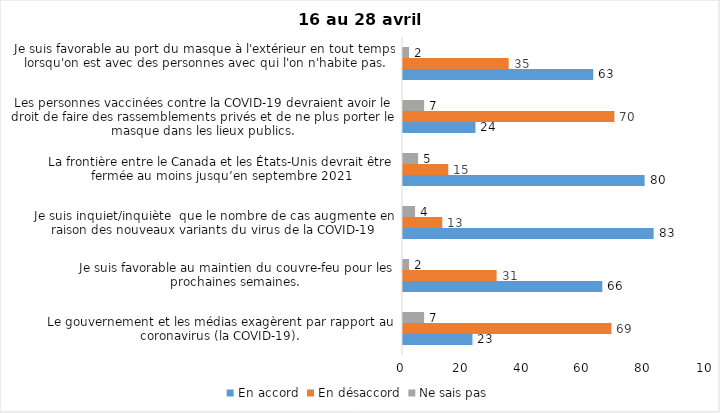
| Category | En accord | En désaccord | Ne sais pas |
|---|---|---|---|
| Le gouvernement et les médias exagèrent par rapport au coronavirus (la COVID-19). | 23 | 69 | 7 |
| Je suis favorable au maintien du couvre-feu pour les prochaines semaines. | 66 | 31 | 2 |
| Je suis inquiet/inquiète  que le nombre de cas augmente en raison des nouveaux variants du virus de la COVID-19 | 83 | 13 | 4 |
| La frontière entre le Canada et les États-Unis devrait être fermée au moins jusqu’en septembre 2021 | 80 | 15 | 5 |
| Les personnes vaccinées contre la COVID-19 devraient avoir le droit de faire des rassemblements privés et de ne plus porter le masque dans les lieux publics. | 24 | 70 | 7 |
| Je suis favorable au port du masque à l'extérieur en tout temps lorsqu'on est avec des personnes avec qui l'on n'habite pas. | 63 | 35 | 2 |